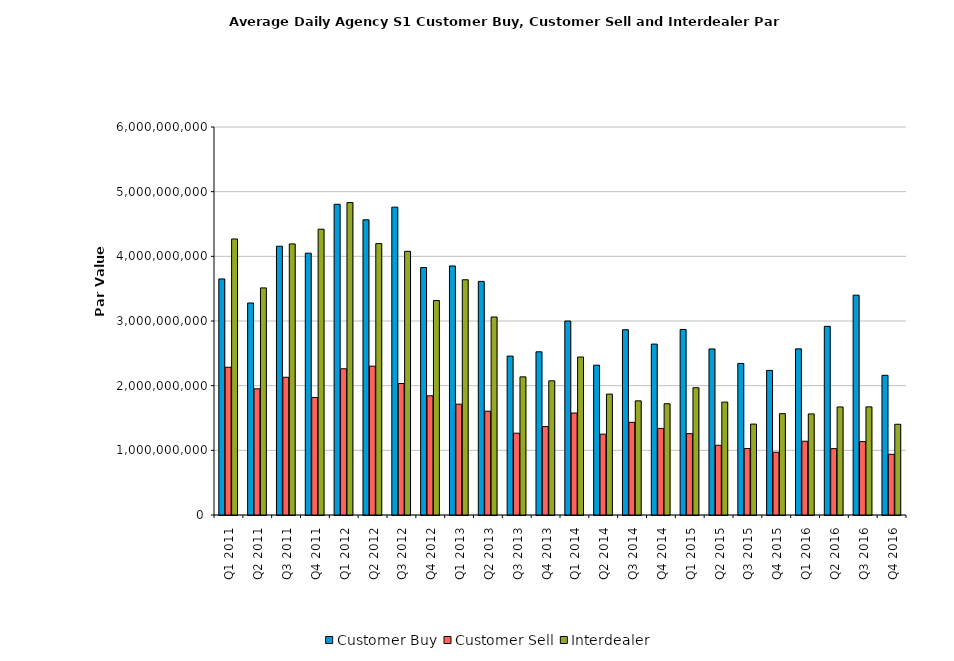
| Category | Customer Buy | Customer Sell | Interdealer |
|---|---|---|---|
| Q1 2011 | 3650213750.701 | 2284978454.007 | 4268516681.583 |
| Q2 2011 | 3278018479.981 | 1951447853.367 | 3511817513.696 |
| Q3 2011 | 4156019129.176 | 2129817820.81 | 4191803339.987 |
| Q4 2011 | 4048809559.675 | 1817417340.88 | 4419578741.148 |
| Q1 2012 | 4805131828.855 | 2261198234.689 | 4831201719.361 |
| Q2 2012 | 4564915316.16 | 2301348797.814 | 4197235917.869 |
| Q3 2012 | 4760626093.801 | 2033059819.746 | 4077567226.814 |
| Q4 2012 | 3826428782.592 | 1843370485.961 | 3316352390.939 |
| Q1 2013 | 3851219631.559 | 1713833452.241 | 3638013212.416 |
| Q2 2013 | 3612298106.7 | 1604934714.305 | 3062072229.235 |
| Q3 2013 | 2457537054.322 | 1264949555.257 | 2136022394.579 |
| Q4 2013 | 2523325341.425 | 1367516311.497 | 2074871198.099 |
| Q1 2014 | 2999642469.29 | 1576921705.138 | 2442904685.331 |
| Q2 2014 | 2316486911.388 | 1249686632.744 | 1869449035.493 |
| Q3 2014 | 2865047105.23 | 1433524489.264 | 1765300999.422 |
| Q4 2014 | 2642657071.748 | 1338943238.666 | 1720591089.445 |
| Q1 2015 | 2869493112.013 | 1258061076.446 | 1968039936.123 |
| Q2 2015 | 2567878881.385 | 1078331270.284 | 1745613692.501 |
| Q3 2015 | 2343524919.084 | 1028269042.485 | 1405607771.711 |
| Q4 2015 | 2235759044.268 | 970391456.275 | 1567503454.138 |
| Q1 2016 | 2568983491.342 | 1140791292.575 | 1563195402.666 |
| Q2 2016 | 2917274475.03 | 1026356965.009 | 1670545845.46 |
| Q3 2016 | 3399325753.161 | 1135281635.486 | 1672242018.388 |
| Q4 2016 | 2160327281.462 | 939002830.424 | 1403044499.216 |